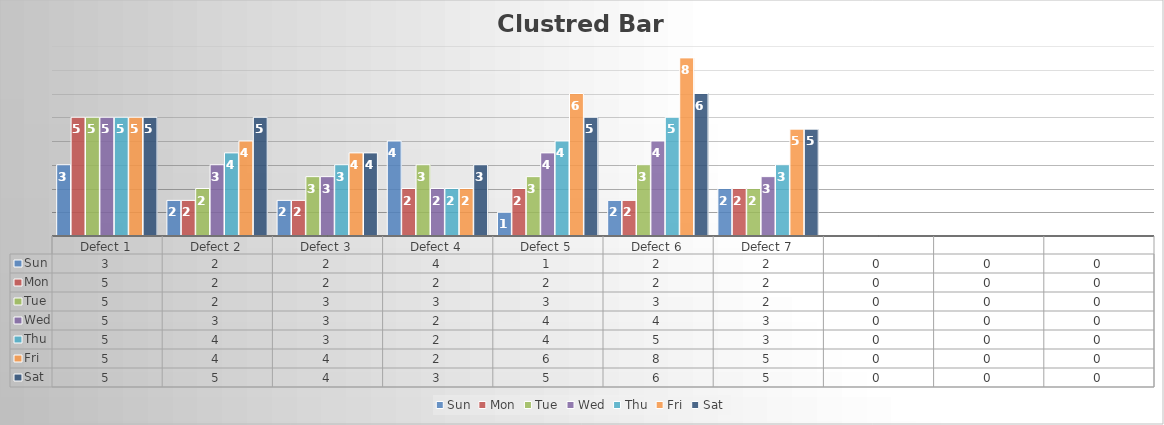
| Category | Sun | Mon | Tue | Wed | Thu | Fri | Sat |
|---|---|---|---|---|---|---|---|
| Defect 1 | 3 | 5 | 5 | 5 | 5 | 5 | 5 |
| Defect 2 | 1.5 | 1.5 | 2 | 3 | 3.5 | 4 | 5 |
| Defect 3 | 1.5 | 1.5 | 2.5 | 2.5 | 3 | 3.5 | 3.5 |
| Defect 4 | 4 | 2 | 3 | 2 | 2 | 2 | 3 |
| Defect 5 | 1 | 2 | 2.5 | 3.5 | 4 | 6 | 5 |
| Defect 6 | 1.5 | 1.5 | 3 | 4 | 5 | 7.5 | 6 |
| Defect 7 | 2 | 2 | 2 | 2.5 | 3 | 4.5 | 4.5 |